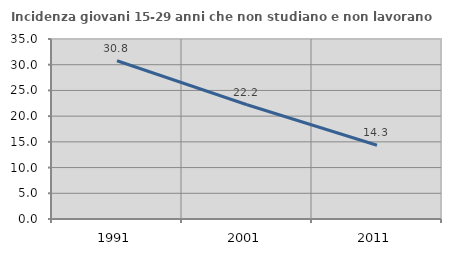
| Category | Incidenza giovani 15-29 anni che non studiano e non lavorano  |
|---|---|
| 1991.0 | 30.769 |
| 2001.0 | 22.222 |
| 2011.0 | 14.338 |